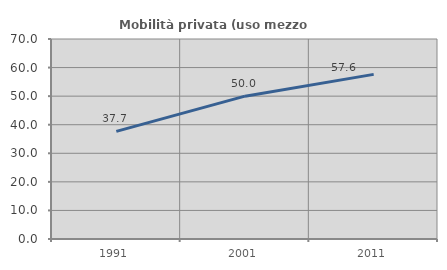
| Category | Mobilità privata (uso mezzo privato) |
|---|---|
| 1991.0 | 37.654 |
| 2001.0 | 49.992 |
| 2011.0 | 57.616 |